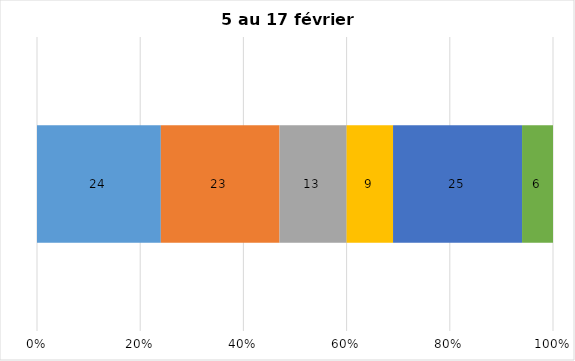
| Category | Plusieurs fois par jour | Une fois par jour | Quelques fois par semaine   | Une fois par semaine ou moins   |  Jamais   |  Je n’utilise pas les médias sociaux |
|---|---|---|---|---|---|---|
| 0 | 24 | 23 | 13 | 9 | 25 | 6 |